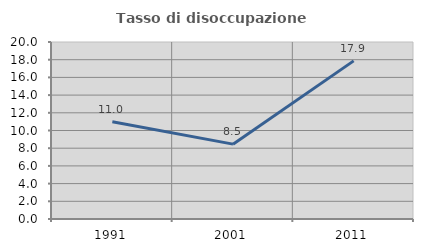
| Category | Tasso di disoccupazione giovanile  |
|---|---|
| 1991.0 | 10.984 |
| 2001.0 | 8.459 |
| 2011.0 | 17.866 |